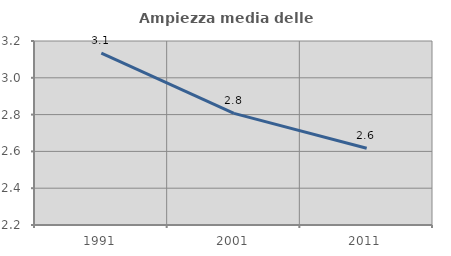
| Category | Ampiezza media delle famiglie |
|---|---|
| 1991.0 | 3.135 |
| 2001.0 | 2.807 |
| 2011.0 | 2.617 |